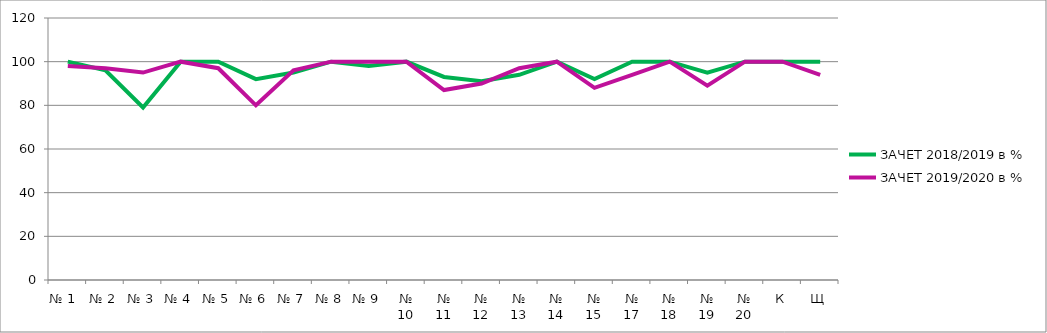
| Category | ЗАЧЕТ 2018/2019 в % | ЗАЧЕТ 2019/2020 в % |
|---|---|---|
| № 1  | 100 | 98 |
| № 2 | 96 | 97 |
| № 3 | 79 | 95 |
| № 4 | 100 | 100 |
| № 5 | 100 | 97 |
| № 6 | 92 | 80 |
| № 7 | 95 | 96 |
| № 8 | 100 | 100 |
| № 9 | 98 | 100 |
| № 10 | 100 | 100 |
| № 11 | 93 | 87 |
| № 12 | 91 | 90 |
| № 13 | 94 | 97 |
| № 14 | 100 | 100 |
| № 15 | 92 | 88 |
| № 17 | 100 | 94 |
| № 18 | 100 | 100 |
| № 19 | 95 | 89 |
| № 20 | 100 | 100 |
| К | 100 | 100 |
| Щ | 100 | 94 |